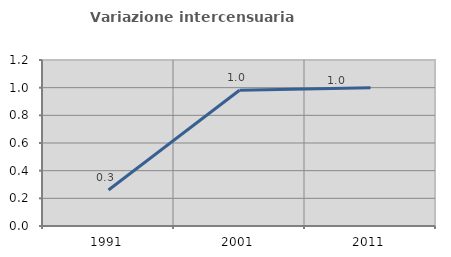
| Category | Variazione intercensuaria annua |
|---|---|
| 1991.0 | 0.26 |
| 2001.0 | 0.981 |
| 2011.0 | 1 |